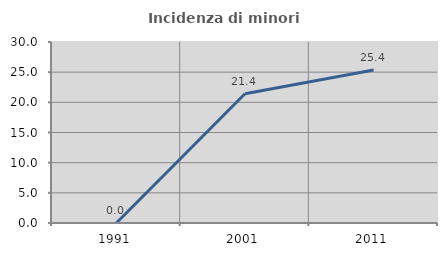
| Category | Incidenza di minori stranieri |
|---|---|
| 1991.0 | 0 |
| 2001.0 | 21.429 |
| 2011.0 | 25.373 |